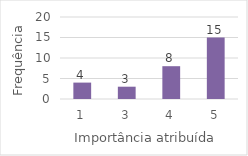
| Category | Series 0 |
|---|---|
| 1.0 | 4 |
| 3.0 | 3 |
| 4.0 | 8 |
| 5.0 | 15 |